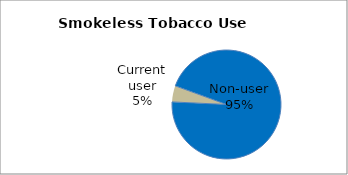
| Category | Series 0 |
|---|---|
| Non-user | 95.198 |
| Current user | 4.802 |